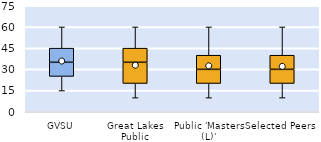
| Category | 25th | 50th | 75th |
|---|---|---|---|
| GVSU | 25 | 10 | 10 |
| Great Lakes Public | 20 | 15 | 10 |
| Public 'Masters (L)' | 20 | 10 | 10 |
| Selected Peers | 20 | 10 | 10 |